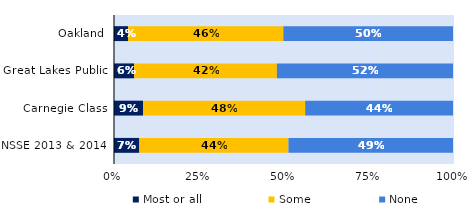
| Category | Most or all | Some | None |
|---|---|---|---|
| Oakland | 0.041 | 0.458 | 0.501 |
| Great Lakes Public | 0.059 | 0.421 | 0.519 |
| Carnegie Class | 0.086 | 0.478 | 0.436 |
| NSSE 2013 & 2014 | 0.075 | 0.44 | 0.485 |